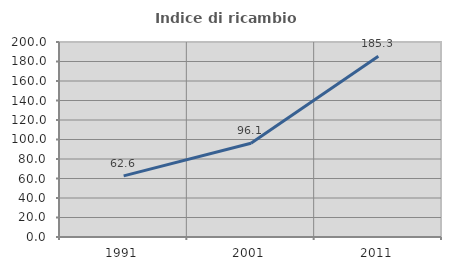
| Category | Indice di ricambio occupazionale  |
|---|---|
| 1991.0 | 62.646 |
| 2001.0 | 96.082 |
| 2011.0 | 185.288 |